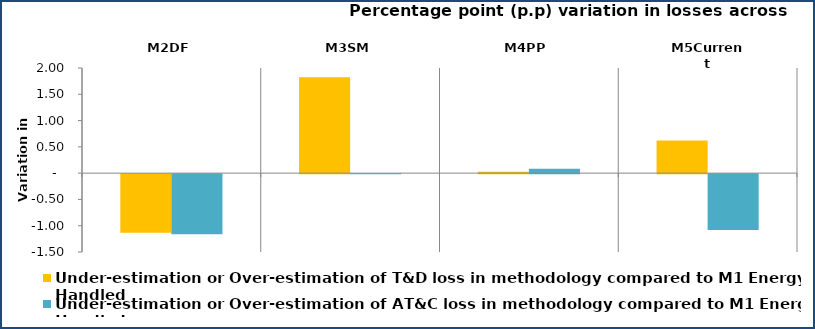
| Category | Under-estimation or Over-estimation of T&D loss in methodology compared to M1 Energy Handled | Under-estimation or Over-estimation of AT&C loss in methodology compared to M1 Energy Handled |
|---|---|---|
| M2DF | -1.114 | -1.142 |
| M3SM | 1.823 | 0 |
| M4PP | 0.026 | 0.084 |
| M5Current | 0.619 | -1.063 |